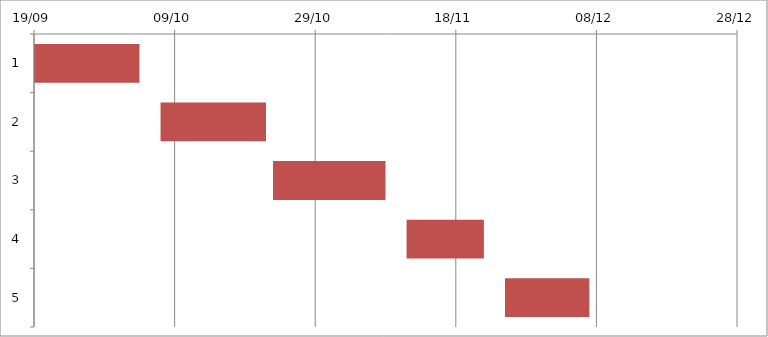
| Category | Fecha de inicio | DURACIÓN |
|---|---|---|
| 0 | 9/19/19 | 15 |
| 1 | 10/7/19 | 15 |
| 2 | 10/23/19 | 16 |
| 3 | 11/11/19 | 11 |
| 4 | 11/25/19 | 12 |